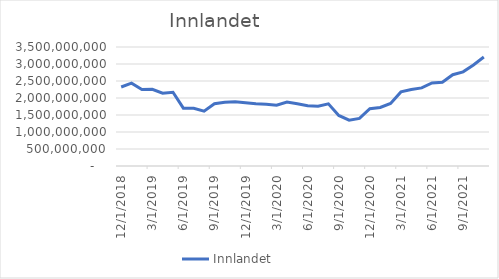
| Category | Innlandet |
|---|---|
| 12/1/18 | 2324456250 |
| 1/1/19 | 2435835416.667 |
| 2/1/19 | 2251247916.667 |
| 3/1/19 | 2256390000 |
| 4/1/19 | 2141633333.333 |
| 5/1/19 | 2169366666.667 |
| 6/1/19 | 1701652500 |
| 7/1/19 | 1697644166.667 |
| 8/1/19 | 1613010833.333 |
| 9/1/19 | 1830819166.667 |
| 10/1/19 | 1877394166.667 |
| 11/1/19 | 1891944166.667 |
| 12/1/19 | 1858410833.333 |
| 1/1/20 | 1828513333.333 |
| 2/1/20 | 1817217500 |
| 3/1/20 | 1785842500 |
| 4/1/20 | 1879721666.667 |
| 5/1/20 | 1830900833.333 |
| 6/1/20 | 1772123333.333 |
| 7/1/20 | 1757685833.333 |
| 8/1/20 | 1828252500 |
| 9/1/20 | 1486065000 |
| 10/1/20 | 1347527500 |
| 11/1/20 | 1399065000 |
| 12/1/20 | 1684440000 |
| 1/1/21 | 1720831666.667 |
| 2/1/21 | 1840994166.667 |
| 3/1/21 | 2179265000 |
| 4/1/21 | 2248465000 |
| 5/1/21 | 2297644166.667 |
| 6/1/21 | 2443756666.667 |
| 7/1/21 | 2462406666.667 |
| 8/1/21 | 2684227500 |
| 9/1/21 | 2769050833.333 |
| 10/1/21 | 2972196666.667 |
| 11/1/21 | 3206223750 |